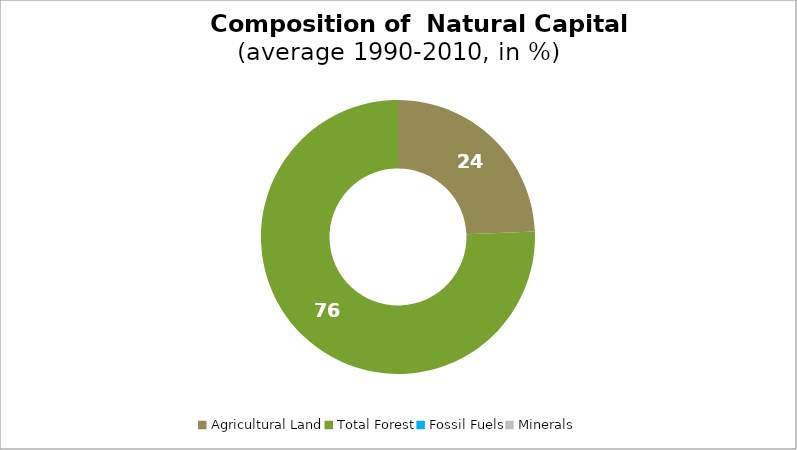
| Category | Series 0 |
|---|---|
| Agricultural Land | 24.372 |
| Total Forest | 75.628 |
| Fossil Fuels | 0 |
| Minerals | 0 |